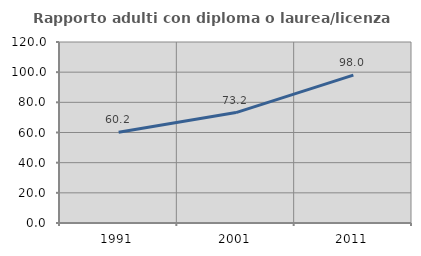
| Category | Rapporto adulti con diploma o laurea/licenza media  |
|---|---|
| 1991.0 | 60.195 |
| 2001.0 | 73.205 |
| 2011.0 | 98.042 |